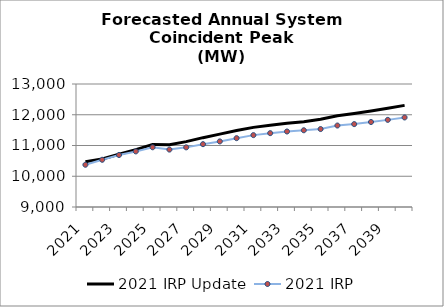
| Category | 2021 IRP Update | 2021 IRP |
|---|---|---|
| 2021.0 | 10471.902 | 10373.619 |
| 2022.0 | 10561.334 | 10535.441 |
| 2023.0 | 10717.346 | 10691.366 |
| 2024.0 | 10863.629 | 10807.838 |
| 2025.0 | 11034.897 | 10942.272 |
| 2026.0 | 11027.225 | 10866.996 |
| 2027.0 | 11125.68 | 10939.547 |
| 2028.0 | 11255.033 | 11043.349 |
| 2029.0 | 11369.65 | 11133.15 |
| 2030.0 | 11486.688 | 11238.494 |
| 2031.0 | 11589.625 | 11337.243 |
| 2032.0 | 11658.097 | 11401.562 |
| 2033.0 | 11721.658 | 11455.422 |
| 2034.0 | 11775.861 | 11495.573 |
| 2035.0 | 11851.66 | 11534.846 |
| 2036.0 | 11966.457 | 11649.535 |
| 2037.0 | 12040.473 | 11695.399 |
| 2038.0 | 12122.133 | 11764.188 |
| 2039.0 | 12210.258 | 11833.412 |
| 2040.0 | 12304.877 | 11912.041 |